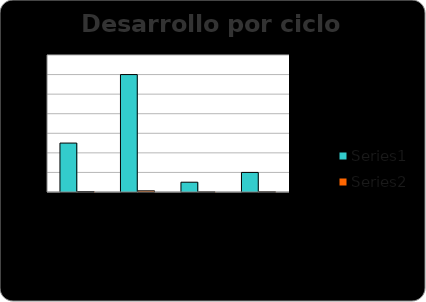
| Category | Series 0 | Series 1 |
|---|---|---|
| I. PLANEAR | 25 | 0.25 |
| II. HACER | 60 | 0.59 |
| III. VERIFICAR | 5 | 0.05 |
| IV. ACTUAR | 10 | 0.1 |